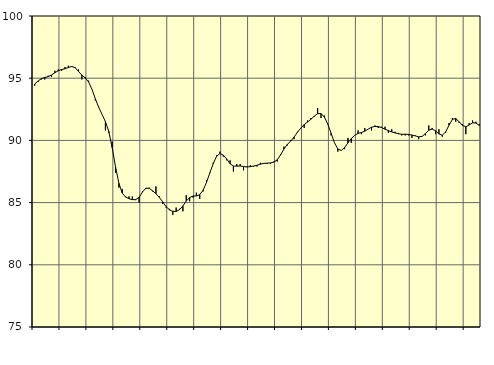
| Category | Piggar | Series 1 |
|---|---|---|
| nan | 94.4 | 94.53 |
| 87.0 | 94.7 | 94.77 |
| 87.0 | 94.9 | 94.97 |
| 87.0 | 94.9 | 95.06 |
| nan | 95.2 | 95.12 |
| 88.0 | 95.1 | 95.26 |
| 88.0 | 95.6 | 95.44 |
| 88.0 | 95.7 | 95.6 |
| nan | 95.6 | 95.7 |
| 89.0 | 95.9 | 95.76 |
| 89.0 | 96 | 95.86 |
| 89.0 | 95.9 | 95.94 |
| nan | 95.9 | 95.84 |
| 90.0 | 95.7 | 95.55 |
| 90.0 | 94.9 | 95.25 |
| 90.0 | 95.1 | 95.02 |
| nan | 94.8 | 94.7 |
| 91.0 | 94.1 | 94.11 |
| 91.0 | 93.2 | 93.35 |
| 91.0 | 92.7 | 92.67 |
| nan | 92.1 | 92.09 |
| 92.0 | 90.8 | 91.51 |
| 92.0 | 90.6 | 90.72 |
| 92.0 | 89.9 | 89.43 |
| nan | 87.4 | 87.88 |
| 93.0 | 86.2 | 86.55 |
| 93.0 | 86.1 | 85.76 |
| 93.0 | 85.5 | 85.44 |
| nan | 85.5 | 85.31 |
| 94.0 | 85.5 | 85.24 |
| 94.0 | 85.2 | 85.24 |
| 94.0 | 85 | 85.43 |
| nan | 85.9 | 85.85 |
| 95.0 | 86.1 | 86.16 |
| 95.0 | 86.2 | 86.15 |
| 95.0 | 85.9 | 85.95 |
| nan | 86.3 | 85.71 |
| 96.0 | 85.5 | 85.42 |
| 96.0 | 84.9 | 85.06 |
| 96.0 | 84.6 | 84.68 |
| nan | 84.5 | 84.42 |
| 97.0 | 84 | 84.3 |
| 97.0 | 84.6 | 84.29 |
| 97.0 | 84.5 | 84.43 |
| nan | 84.3 | 84.74 |
| 98.0 | 85.6 | 85.12 |
| 98.0 | 85.1 | 85.41 |
| 98.0 | 85.4 | 85.53 |
| nan | 85.8 | 85.53 |
| 99.0 | 85.3 | 85.64 |
| 99.0 | 85.9 | 85.99 |
| 99.0 | 86.8 | 86.62 |
| nan | 87.4 | 87.38 |
| 0.0 | 88.2 | 88.13 |
| 0.0 | 88.8 | 88.72 |
| 0.0 | 89.1 | 88.94 |
| nan | 88.7 | 88.82 |
| 1.0 | 88.4 | 88.5 |
| 1.0 | 88.4 | 88.13 |
| 1.0 | 87.5 | 87.94 |
| nan | 88.1 | 87.93 |
| 2.0 | 88.1 | 87.94 |
| 2.0 | 87.6 | 87.9 |
| 2.0 | 87.9 | 87.86 |
| nan | 88 | 87.89 |
| 3.0 | 87.9 | 87.94 |
| 3.0 | 87.9 | 88 |
| 3.0 | 88.2 | 88.09 |
| nan | 88.1 | 88.15 |
| 4.0 | 88.1 | 88.17 |
| 4.0 | 88.1 | 88.19 |
| 4.0 | 88.3 | 88.25 |
| nan | 88.3 | 88.44 |
| 5.0 | 88.9 | 88.84 |
| 5.0 | 89.5 | 89.3 |
| 5.0 | 89.6 | 89.68 |
| nan | 90 | 89.94 |
| 6.0 | 90.1 | 90.27 |
| 6.0 | 90.7 | 90.65 |
| 6.0 | 91 | 90.99 |
| nan | 91 | 91.27 |
| 7.0 | 91.6 | 91.47 |
| 7.0 | 91.8 | 91.7 |
| 7.0 | 91.9 | 91.95 |
| nan | 92.6 | 92.15 |
| 8.0 | 91.8 | 92.16 |
| 8.0 | 92 | 91.88 |
| 8.0 | 91.3 | 91.32 |
| nan | 90.4 | 90.57 |
| 9.0 | 89.8 | 89.81 |
| 9.0 | 89.1 | 89.31 |
| 9.0 | 89.2 | 89.19 |
| nan | 89.3 | 89.43 |
| 10.0 | 90.2 | 89.8 |
| 10.0 | 89.8 | 90.15 |
| 10.0 | 90.4 | 90.41 |
| nan | 90.8 | 90.56 |
| 11.0 | 90.5 | 90.64 |
| 11.0 | 91 | 90.74 |
| 11.0 | 90.9 | 90.91 |
| nan | 90.8 | 91.06 |
| 12.0 | 91.2 | 91.12 |
| 12.0 | 91 | 91.11 |
| 12.0 | 91.1 | 91.03 |
| nan | 91.1 | 90.9 |
| 13.0 | 90.6 | 90.79 |
| 13.0 | 90.9 | 90.68 |
| 13.0 | 90.7 | 90.6 |
| nan | 90.6 | 90.53 |
| 14.0 | 90.4 | 90.49 |
| 14.0 | 90.4 | 90.5 |
| 14.0 | 90.4 | 90.48 |
| nan | 90.2 | 90.43 |
| 15.0 | 90.4 | 90.36 |
| 15.0 | 90.1 | 90.29 |
| 15.0 | 90.3 | 90.32 |
| nan | 90.4 | 90.55 |
| 16.0 | 91.2 | 90.82 |
| 16.0 | 91 | 90.91 |
| 16.0 | 90.5 | 90.77 |
| nan | 90.9 | 90.52 |
| 17.0 | 90.3 | 90.42 |
| 17.0 | 90.6 | 90.68 |
| 17.0 | 91.4 | 91.22 |
| nan | 91.8 | 91.69 |
| 18.0 | 91.5 | 91.76 |
| 18.0 | 91.4 | 91.5 |
| 18.0 | 91.3 | 91.2 |
| nan | 90.5 | 91.1 |
| 19.0 | 91.4 | 91.24 |
| 19.0 | 91.6 | 91.41 |
| 19.0 | 91.5 | 91.4 |
| nan | 91.3 | 91.2 |